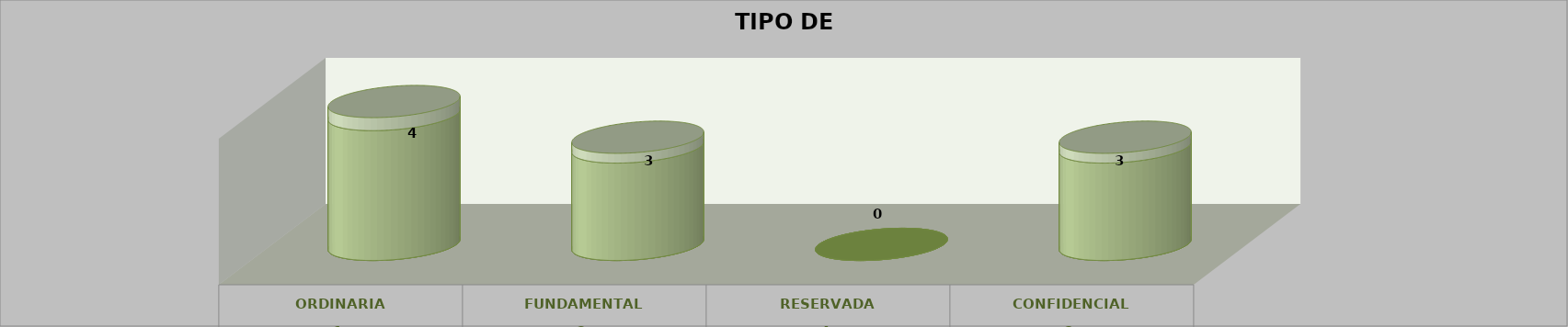
| Category | Series 0 | Series 2 | Series 1 | Series 3 | Series 4 |
|---|---|---|---|---|---|
| 0 |  |  |  | 4 | 0.4 |
| 1 |  |  |  | 3 | 0.3 |
| 2 |  |  |  | 0 | 0 |
| 3 |  |  |  | 3 | 0.3 |